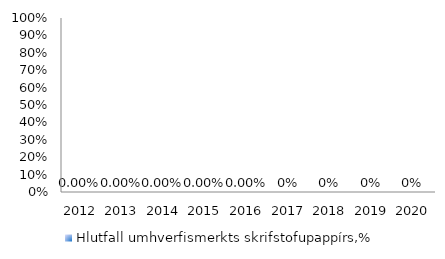
| Category | Hlutfall umhverfismerkts skrifstofupappírs,% |
|---|---|
| 2012.0 | 0 |
| 2013.0 | 0 |
| 2014.0 | 0 |
| 2015.0 | 0 |
| 2016.0 | 0 |
| 2017.0 | 0 |
| 2018.0 | 0 |
| 2019.0 | 0 |
| 2020.0 | 0 |